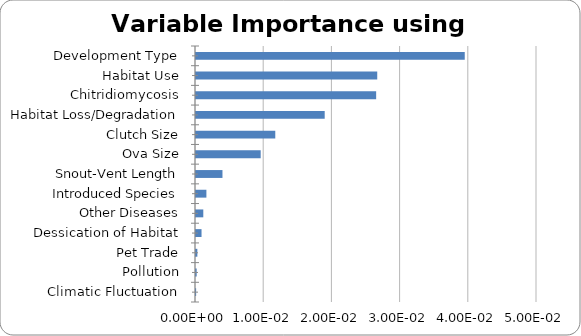
| Category | Series 0 |
|---|---|
| Development Type | 0.039 |
| Habitat Use | 0.027 |
| Chitridiomycosis | 0.026 |
| Habitat Loss/Degradation | 0.019 |
| Clutch Size | 0.012 |
| Ova Size | 0.009 |
| Snout-Vent Length | 0.004 |
| Introduced Species | 0.002 |
| Other Diseases | 0.001 |
| Dessication of Habitat | 0.001 |
| Pet Trade | 0 |
| Pollution | 0 |
| Climatic Fluctuation | 0 |